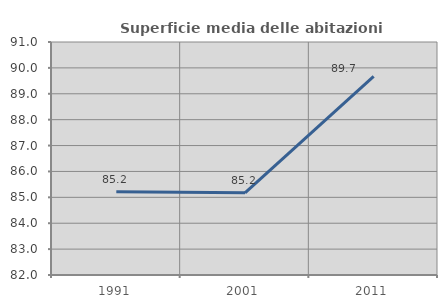
| Category | Superficie media delle abitazioni occupate |
|---|---|
| 1991.0 | 85.216 |
| 2001.0 | 85.174 |
| 2011.0 | 89.672 |